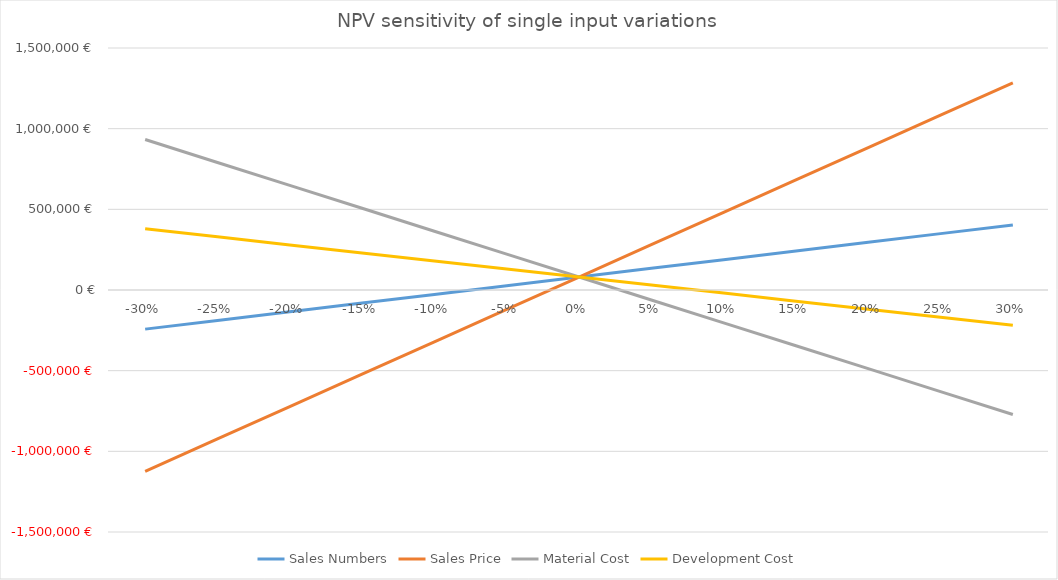
| Category | Sales Numbers | Sales Price | Material Cost | Development Cost |
|---|---|---|---|---|
| -0.3 | -242519.102 | -1123619.376 | 932526.687 | 379145.126 |
| -0.25 | -188704.544 | -922954.772 | 790500.281 | 329348.98 |
| -0.2 | -134889.985 | -722290.168 | 648473.874 | 279552.834 |
| -0.15 | -81075.426 | -521625.563 | 506447.468 | 229756.688 |
| -0.1 | -27260.868 | -320960.959 | 364421.062 | 179960.542 |
| -0.05 | 26553.691 | -120296.355 | 222394.656 | 130164.395 |
| 0.0 | 80368.249 | 80368.249 | 80368.249 | 80368.249 |
| 0.05 | 134182.808 | 281032.854 | -61658.157 | 30572.103 |
| 0.1 | 187997.367 | 481697.458 | -203684.563 | -19224.043 |
| 0.15 | 241811.925 | 682362.062 | -345710.969 | -69020.189 |
| 0.2 | 295626.484 | 883026.666 | -487737.376 | -118816.335 |
| 0.25 | 349441.042 | 1083691.271 | -629763.782 | -168612.481 |
| 0.3 | 403255.601 | 1284355.875 | -771790.188 | -218408.627 |